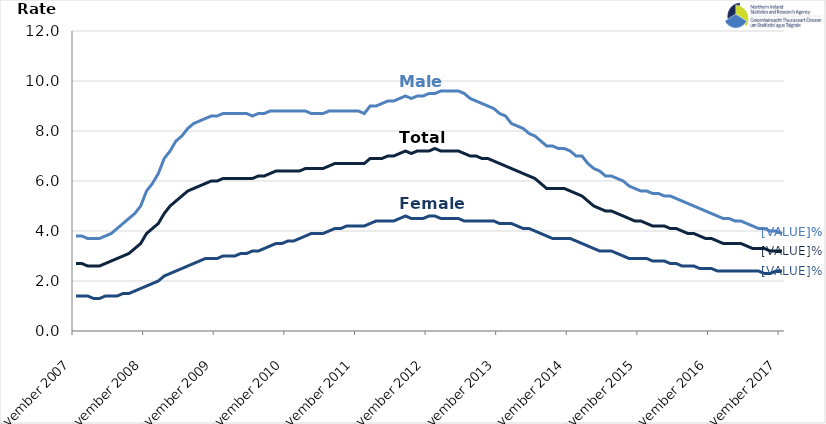
| Category | Male | Female | Total |
|---|---|---|---|
| 2007-11-01 | 3.8 | 1.4 | 2.7 |
| 2007-12-01 | 3.8 | 1.4 | 2.7 |
| 2008-01-01 | 3.7 | 1.4 | 2.6 |
| 2008-02-01 | 3.7 | 1.3 | 2.6 |
| 2008-03-01 | 3.7 | 1.3 | 2.6 |
| 2008-04-01 | 3.8 | 1.4 | 2.7 |
| 2008-05-01 | 3.9 | 1.4 | 2.8 |
| 2008-06-01 | 4.1 | 1.4 | 2.9 |
| 2008-07-01 | 4.3 | 1.5 | 3 |
| 2008-08-01 | 4.5 | 1.5 | 3.1 |
| 2008-09-01 | 4.7 | 1.6 | 3.3 |
| 2008-10-01 | 5 | 1.7 | 3.5 |
| 2008-11-01 | 5.6 | 1.8 | 3.9 |
| 2008-12-01 | 5.9 | 1.9 | 4.1 |
| 2009-01-01 | 6.3 | 2 | 4.3 |
| 2009-02-01 | 6.9 | 2.2 | 4.7 |
| 2009-03-01 | 7.2 | 2.3 | 5 |
| 2009-04-01 | 7.6 | 2.4 | 5.2 |
| 2009-05-01 | 7.8 | 2.5 | 5.4 |
| 2009-06-01 | 8.1 | 2.6 | 5.6 |
| 2009-07-01 | 8.3 | 2.7 | 5.7 |
| 2009-08-01 | 8.4 | 2.8 | 5.8 |
| 2009-09-01 | 8.5 | 2.9 | 5.9 |
| 2009-10-01 | 8.6 | 2.9 | 6 |
| 2009-11-01 | 8.6 | 2.9 | 6 |
| 2009-12-01 | 8.7 | 3 | 6.1 |
| 2010-01-01 | 8.7 | 3 | 6.1 |
| 2010-02-01 | 8.7 | 3 | 6.1 |
| 2010-03-01 | 8.7 | 3.1 | 6.1 |
| 2010-04-01 | 8.7 | 3.1 | 6.1 |
| 2010-05-01 | 8.6 | 3.2 | 6.1 |
| 2010-06-01 | 8.7 | 3.2 | 6.2 |
| 2010-07-01 | 8.7 | 3.3 | 6.2 |
| 2010-08-01 | 8.8 | 3.4 | 6.3 |
| 2010-09-01 | 8.8 | 3.5 | 6.4 |
| 2010-10-01 | 8.8 | 3.5 | 6.4 |
| 2010-11-01 | 8.8 | 3.6 | 6.4 |
| 2010-12-01 | 8.8 | 3.6 | 6.4 |
| 2011-01-01 | 8.8 | 3.7 | 6.4 |
| 2011-02-01 | 8.8 | 3.8 | 6.5 |
| 2011-03-01 | 8.7 | 3.9 | 6.5 |
| 2011-04-01 | 8.7 | 3.9 | 6.5 |
| 2011-05-01 | 8.7 | 3.9 | 6.5 |
| 2011-06-01 | 8.8 | 4 | 6.6 |
| 2011-07-01 | 8.8 | 4.1 | 6.7 |
| 2011-08-01 | 8.8 | 4.1 | 6.7 |
| 2011-09-01 | 8.8 | 4.2 | 6.7 |
| 2011-10-01 | 8.8 | 4.2 | 6.7 |
| 2011-11-01 | 8.8 | 4.2 | 6.7 |
| 2011-12-01 | 8.7 | 4.2 | 6.7 |
| 2012-01-01 | 9 | 4.3 | 6.9 |
| 2012-02-01 | 9 | 4.4 | 6.9 |
| 2012-03-01 | 9.1 | 4.4 | 6.9 |
| 2012-04-01 | 9.2 | 4.4 | 7 |
| 2012-05-01 | 9.2 | 4.4 | 7 |
| 2012-06-01 | 9.3 | 4.5 | 7.1 |
| 2012-07-01 | 9.4 | 4.6 | 7.2 |
| 2012-08-01 | 9.3 | 4.5 | 7.1 |
| 2012-09-01 | 9.4 | 4.5 | 7.2 |
| 2012-10-01 | 9.4 | 4.5 | 7.2 |
| 2012-11-01 | 9.5 | 4.6 | 7.2 |
| 2012-12-01 | 9.5 | 4.6 | 7.3 |
| 2013-01-01 | 9.6 | 4.5 | 7.2 |
| 2013-02-01 | 9.6 | 4.5 | 7.2 |
| 2013-03-01 | 9.6 | 4.5 | 7.2 |
| 2013-04-01 | 9.6 | 4.5 | 7.2 |
| 2013-05-01 | 9.5 | 4.4 | 7.1 |
| 2013-06-01 | 9.3 | 4.4 | 7 |
| 2013-07-01 | 9.2 | 4.4 | 7 |
| 2013-08-01 | 9.1 | 4.4 | 6.9 |
| 2013-09-01 | 9 | 4.4 | 6.9 |
| 2013-10-01 | 8.9 | 4.4 | 6.8 |
| 2013-11-01 | 8.7 | 4.3 | 6.7 |
| 2013-12-01 | 8.6 | 4.3 | 6.6 |
| 2014-01-01 | 8.3 | 4.3 | 6.5 |
| 2014-02-01 | 8.2 | 4.2 | 6.4 |
| 2014-03-01 | 8.1 | 4.1 | 6.3 |
| 2014-04-01 | 7.9 | 4.1 | 6.2 |
| 2014-05-01 | 7.8 | 4 | 6.1 |
| 2014-06-01 | 7.6 | 3.9 | 5.9 |
| 2014-07-01 | 7.4 | 3.8 | 5.7 |
| 2014-08-01 | 7.4 | 3.7 | 5.7 |
| 2014-09-01 | 7.3 | 3.7 | 5.7 |
| 2014-10-01 | 7.3 | 3.7 | 5.7 |
| 2014-11-01 | 7.2 | 3.7 | 5.6 |
| 2014-12-01 | 7 | 3.6 | 5.5 |
| 2015-01-01 | 7 | 3.5 | 5.4 |
| 2015-02-01 | 6.7 | 3.4 | 5.2 |
| 2015-03-01 | 6.5 | 3.3 | 5 |
| 2015-04-01 | 6.4 | 3.2 | 4.9 |
| 2015-05-01 | 6.2 | 3.2 | 4.8 |
| 2015-06-01 | 6.2 | 3.2 | 4.8 |
| 2015-07-01 | 6.1 | 3.1 | 4.7 |
| 2015-08-01 | 6 | 3 | 4.6 |
| 2015-09-01 | 5.8 | 2.9 | 4.5 |
| 2015-10-01 | 5.7 | 2.9 | 4.4 |
| 2015-11-01 | 5.6 | 2.9 | 4.4 |
| 2015-12-01 | 5.6 | 2.9 | 4.3 |
| 2016-01-01 | 5.5 | 2.8 | 4.2 |
| 2016-02-01 | 5.5 | 2.8 | 4.2 |
| 2016-03-01 | 5.4 | 2.8 | 4.2 |
| 2016-04-01 | 5.4 | 2.7 | 4.1 |
| 2016-05-01 | 5.3 | 2.7 | 4.1 |
| 2016-06-01 | 5.2 | 2.6 | 4 |
| 2016-07-01 | 5.1 | 2.6 | 3.9 |
| 2016-08-01 | 5 | 2.6 | 3.9 |
| 2016-09-01 | 4.9 | 2.5 | 3.8 |
| 2016-10-01 | 4.8 | 2.5 | 3.7 |
| 2016-11-01 | 4.7 | 2.5 | 3.7 |
| 2016-12-01 | 4.6 | 2.4 | 3.6 |
| 2017-01-01 | 4.5 | 2.4 | 3.5 |
| 2017-02-01 | 4.5 | 2.4 | 3.5 |
| 2017-03-01 | 4.4 | 2.4 | 3.5 |
| 2017-04-01 | 4.4 | 2.4 | 3.5 |
| 2017-05-01 | 4.3 | 2.4 | 3.4 |
| 2017-06-01 | 4.2 | 2.4 | 3.3 |
| 2017-07-01 | 4.1 | 2.4 | 3.3 |
| 2017-08-01 | 4.1 | 2.3 | 3.3 |
| 2017-09-01 | 4 | 2.3 | 3.2 |
| 2017-10-01 | 4 | 2.4 | 3.2 |
| 2017-11-01 | 3.9 | 2.4 | 3.2 |